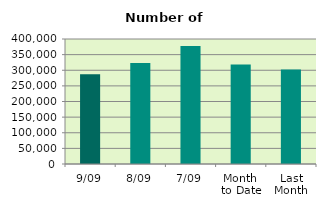
| Category | Series 0 |
|---|---|
| 9/09 | 287020 |
| 8/09 | 323076 |
| 7/09 | 377996 |
| Month 
to Date | 318218 |
| Last
Month | 302693.565 |